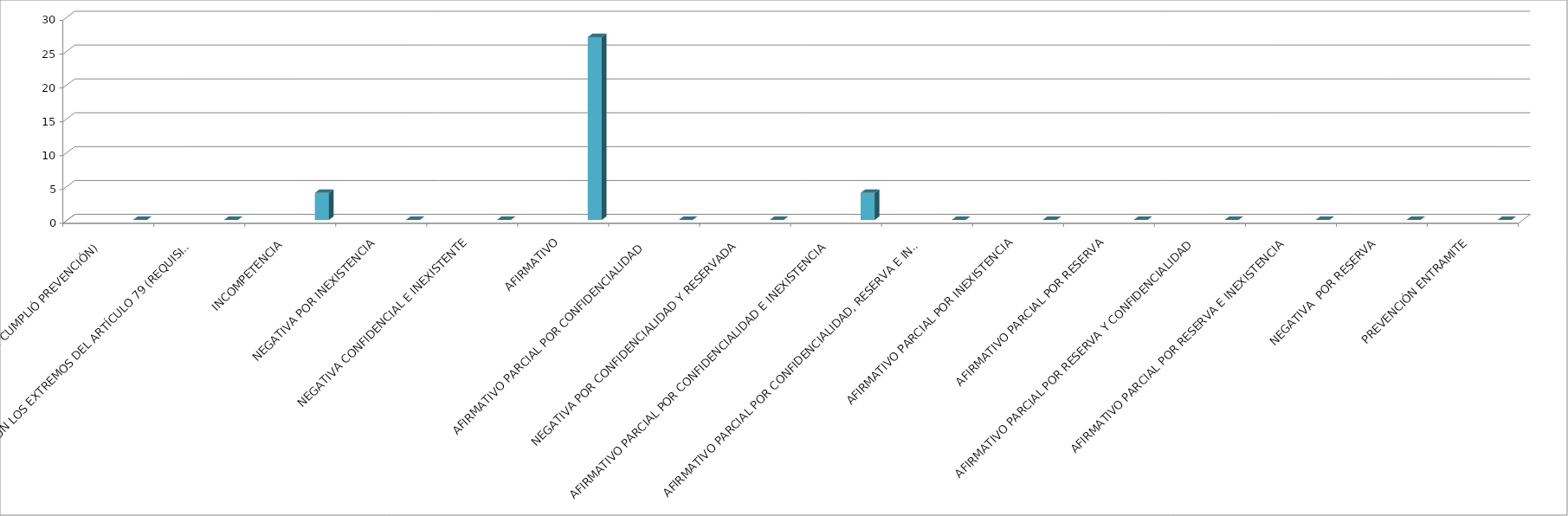
| Category | Series 0 | Series 1 | Series 2 | Series 3 | Series 4 |
|---|---|---|---|---|---|
| SE TIENE POR NO PRESENTADA ( NO CUMPLIÓ PREVENCIÓN) |  |  |  |  | 0 |
| NO CUMPLIO CON LOS EXTREMOS DEL ARTÍCULO 79 (REQUISITOS) |  |  |  |  | 0 |
| INCOMPETENCIA  |  |  |  |  | 4 |
| NEGATIVA POR INEXISTENCIA |  |  |  |  | 0 |
| NEGATIVA CONFIDENCIAL E INEXISTENTE |  |  |  |  | 0 |
| AFIRMATIVO |  |  |  |  | 27 |
| AFIRMATIVO PARCIAL POR CONFIDENCIALIDAD  |  |  |  |  | 0 |
| NEGATIVA POR CONFIDENCIALIDAD Y RESERVADA |  |  |  |  | 0 |
| AFIRMATIVO PARCIAL POR CONFIDENCIALIDAD E INEXISTENCIA |  |  |  |  | 4 |
| AFIRMATIVO PARCIAL POR CONFIDENCIALIDAD, RESERVA E INEXISTENCIA |  |  |  |  | 0 |
| AFIRMATIVO PARCIAL POR INEXISTENCIA |  |  |  |  | 0 |
| AFIRMATIVO PARCIAL POR RESERVA |  |  |  |  | 0 |
| AFIRMATIVO PARCIAL POR RESERVA Y CONFIDENCIALIDAD |  |  |  |  | 0 |
| AFIRMATIVO PARCIAL POR RESERVA E INEXISTENCIA |  |  |  |  | 0 |
| NEGATIVA  POR RESERVA |  |  |  |  | 0 |
| PREVENCIÓN ENTRAMITE |  |  |  |  | 0 |